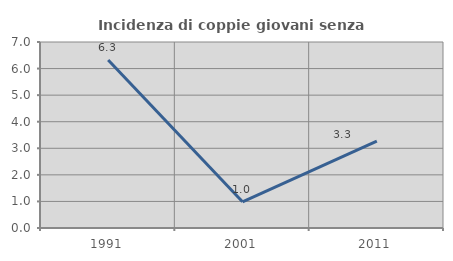
| Category | Incidenza di coppie giovani senza figli |
|---|---|
| 1991.0 | 6.322 |
| 2001.0 | 0.985 |
| 2011.0 | 3.271 |